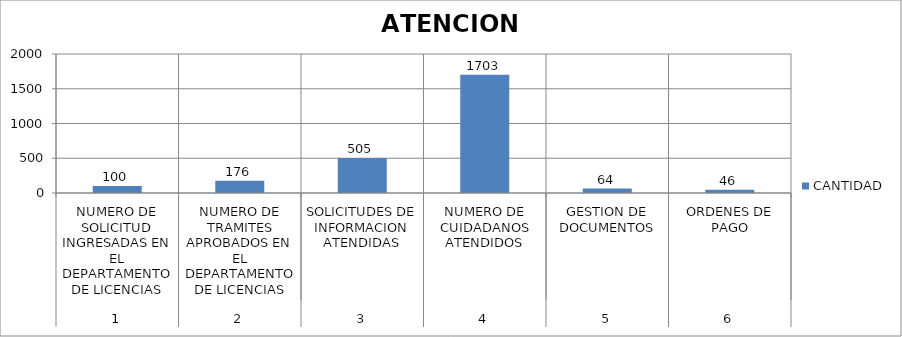
| Category | CANTIDAD |
|---|---|
| 0 | 100 |
| 1 | 176 |
| 2 | 505 |
| 3 | 1703 |
| 4 | 64 |
| 5 | 46 |